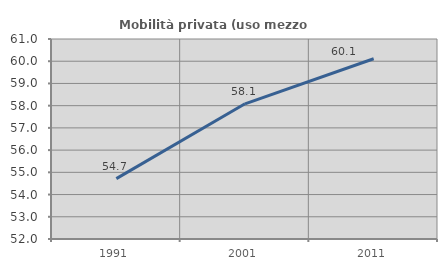
| Category | Mobilità privata (uso mezzo privato) |
|---|---|
| 1991.0 | 54.717 |
| 2001.0 | 58.084 |
| 2011.0 | 60.112 |